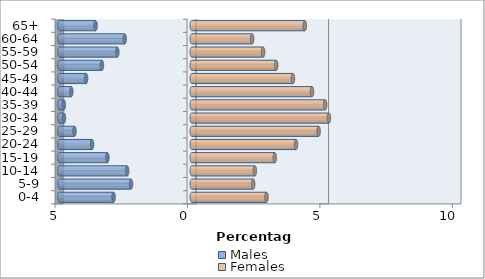
| Category | Males | Females |
|---|---|---|
| 0-4 | -2.952 | 2.82 |
| 5-9 | -2.294 | 2.318 |
| 10-14 | -2.442 | 2.382 |
| 15-19 | -3.185 | 3.134 |
| 20-24 | -3.766 | 3.935 |
| 25-29 | -4.428 | 4.789 |
| 30-34 | -4.826 | 5.176 |
| 35-39 | -4.83 | 5.035 |
| 40-44 | -4.55 | 4.539 |
| 45-49 | -3.99 | 3.819 |
| 50-54 | -3.392 | 3.187 |
| 55-59 | -2.811 | 2.692 |
| 60-64 | -2.531 | 2.279 |
| 65+ | -3.631 | 4.266 |